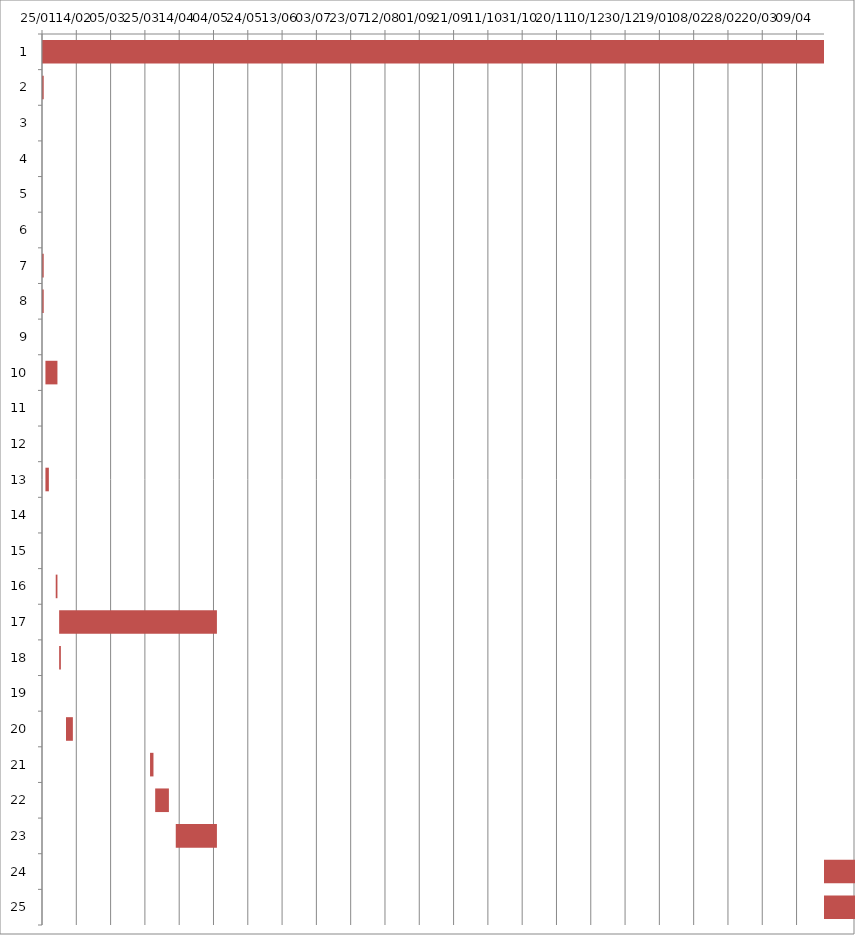
| Category | Fecha de inicio | DURACIÓN |
|---|---|---|
| 0 | 1/25/16 | 708 |
| 1 | 1/25/16 | 1 |
| 2 | 1/25/16 | 0 |
| 3 | 1/25/16 | 0 |
| 4 | 1/25/16 | 0 |
| 5 | 1/25/16 | 0 |
| 6 | 1/25/16 | 1 |
| 7 | 1/25/16 | 1 |
| 8 | 1/26/16 | 0 |
| 9 | 1/27/16 | 7 |
| 10 | 1/27/16 | 0 |
| 11 | 1/28/16 | 0 |
| 12 | 1/27/16 | 2 |
| 13 | 2/1/16 | 0 |
| 14 | 2/2/16 | 0 |
| 15 | 2/2/16 | 1 |
| 16 | 2/4/16 | 92 |
| 17 | 2/4/16 | 1 |
| 18 | 2/5/16 | 0 |
| 19 | 2/8/16 | 4 |
| 20 | 3/28/16 | 2 |
| 21 | 3/31/16 | 8 |
| 22 | 4/12/16 | 24 |
| 23 | 11/1/17 | 62 |
| 24 | 11/1/17 | 62 |